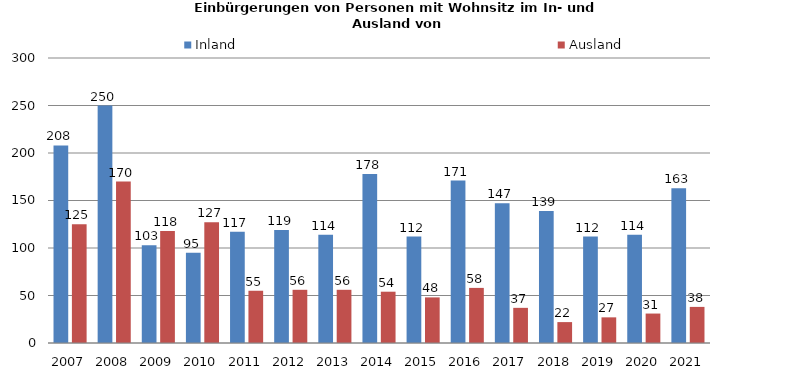
| Category | Inland | Ausland |
|---|---|---|
| 2007.0 | 208 | 125 |
| 2008.0 | 250 | 170 |
| 2009.0 | 103 | 118 |
| 2010.0 | 95 | 127 |
| 2011.0 | 117 | 55 |
| 2012.0 | 119 | 56 |
| 2013.0 | 114 | 56 |
| 2014.0 | 178 | 54 |
| 2015.0 | 112 | 48 |
| 2016.0 | 171 | 58 |
| 2017.0 | 147 | 37 |
| 2018.0 | 139 | 22 |
| 2019.0 | 112 | 27 |
| 2020.0 | 114 | 31 |
| 2021.0 | 163 | 38 |